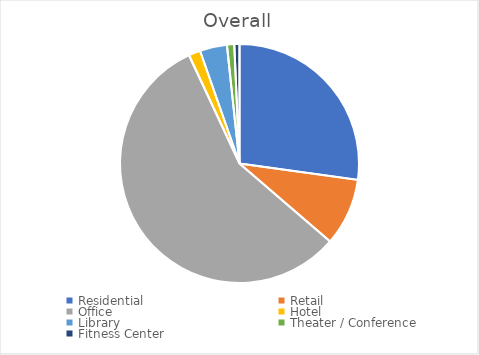
| Category | Series 0 |
|---|---|
| Residential | 0.312 |
| Retail | 0.104 |
| Office | 0.65 |
| Hotel | 0.018 |
| Library | 0.042 |
| Theater / Conference | 0.011 |
| Fitness Center | 0.008 |